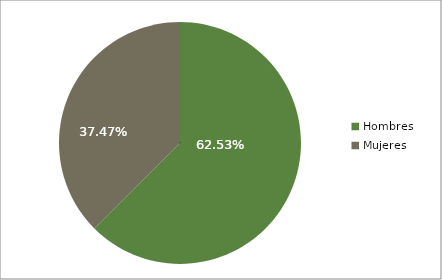
| Category | Series 0 |
|---|---|
| Hombres | 0.625 |
| Mujeres | 0.375 |